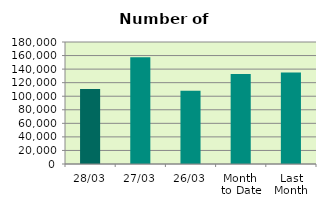
| Category | Series 0 |
|---|---|
| 28/03 | 110662 |
| 27/03 | 157424 |
| 26/03 | 108020 |
| Month 
to Date | 132727.9 |
| Last
Month | 135041.7 |